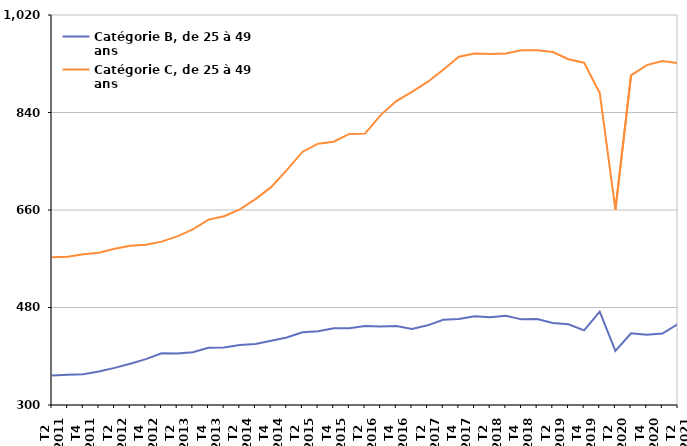
| Category | Catégorie B, de 25 à 49 ans | Catégorie C, de 25 à 49 ans |
|---|---|---|
| T2
2011 | 354.6 | 572.9 |
| T3
2011 | 356 | 573.7 |
| T4
2011 | 356.7 | 578.3 |
| T1
2012 | 361.7 | 581.2 |
| T2
2012 | 368.5 | 588.4 |
| T3
2012 | 376.3 | 593.9 |
| T4
2012 | 384.6 | 595.8 |
| T1
2013 | 395.5 | 601.6 |
| T2
2013 | 395 | 611.2 |
| T3
2013 | 397.5 | 624.1 |
| T4
2013 | 405.5 | 642.2 |
| T1
2014 | 406.2 | 648.5 |
| T2
2014 | 410.7 | 661.3 |
| T3
2014 | 412.5 | 680 |
| T4
2014 | 418.8 | 702.2 |
| T1
2015 | 424.7 | 733.5 |
| T2
2015 | 434.3 | 767.2 |
| T3
2015 | 436.1 | 782.5 |
| T4
2015 | 441.5 | 786 |
| T1
2016 | 441.6 | 800.5 |
| T2
2016 | 445.9 | 801 |
| T3
2016 | 444.9 | 835.2 |
| T4
2016 | 445.8 | 861 |
| T1
2017 | 440.3 | 878.1 |
| T2
2017 | 447.1 | 896.4 |
| T3
2017 | 457.2 | 919 |
| T4
2017 | 458.7 | 943.1 |
| T1
2018 | 463.7 | 948.7 |
| T2
2018 | 462.1 | 947.8 |
| T3
2018 | 464.6 | 948.8 |
| T4
2018 | 458.1 | 954.9 |
| T1
2019 | 458.6 | 955.1 |
| T2
2019 | 451.5 | 951.7 |
| T3
2019 | 449 | 938.4 |
| T4
2019 | 437.8 | 931.9 |
| T1
2020 | 472.4 | 875.8 |
| T2
2020 | 399.8 | 660.8 |
| T3
2020 | 432.5 | 908.6 |
| T4
2020 | 429.6 | 927.5 |
| T1
2021 | 431.9 | 935 |
| T2
2021 | 449.6 | 931 |